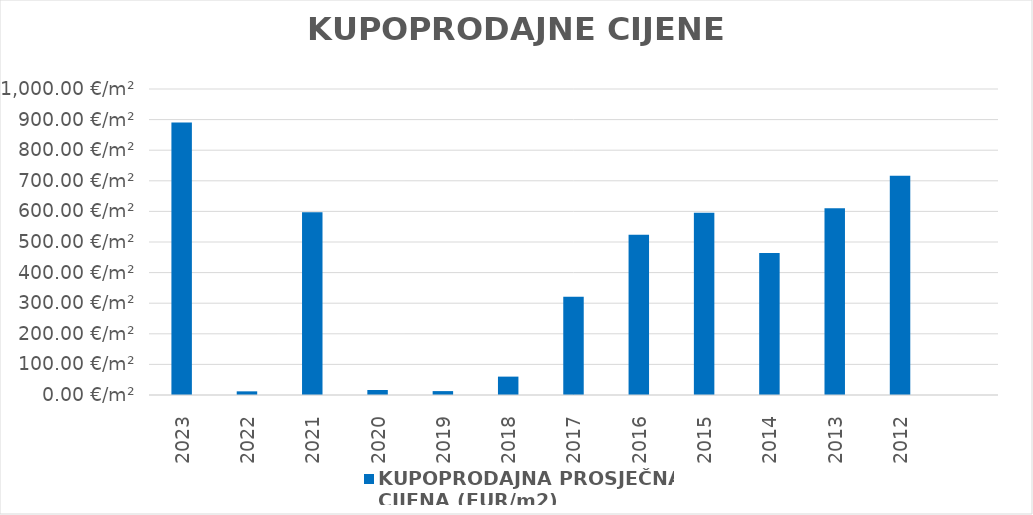
| Category | KUPOPRODAJNA PROSJEČNA 
CIJENA (EUR/m2) |
|---|---|
| 2023 | 1902-06-08 04:33:56 |
| 2022 | 1900-01-11 22:51:20 |
| 2021 | 1901-08-19 11:55:17 |
| 2020 | 1900-01-16 08:25:19 |
| 2019 | 1900-01-12 17:46:57 |
| 2018 | 1900-02-28 01:30:23 |
| 2017 | 1900-11-16 09:14:21 |
| 2016 | 1901-06-06 15:17:07 |
| 2015 | 1901-08-17 17:46:46 |
| 2014 | 1901-04-08 08:50:53 |
| 2013 | 1901-09-01 13:45:38 |
| 2012 | 1901-12-16 19:30:30 |